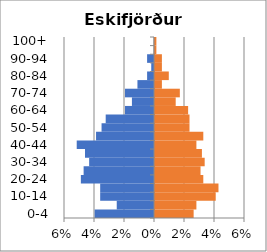
| Category | % Men | % Women |
|---|---|---|
| 0-4 | -0.04 | 0.026 |
| 5-9 | -0.025 | 0.028 |
| 10-14 | -0.036 | 0.04 |
| 15-19 | -0.036 | 0.042 |
| 20-24 | -0.049 | 0.032 |
| 25-29 | -0.047 | 0.03 |
| 30-34 | -0.043 | 0.033 |
| 35-39 | -0.046 | 0.031 |
| 40-44 | -0.052 | 0.028 |
| 45-49 | -0.039 | 0.032 |
| 50-54 | -0.035 | 0.023 |
| 55-59 | -0.032 | 0.023 |
| 60-64 | -0.019 | 0.022 |
| 65-69 | -0.015 | 0.014 |
| 70-74 | -0.019 | 0.017 |
| 75-79 | -0.011 | 0.005 |
| 80-84 | -0.005 | 0.009 |
| 85-89 | -0.002 | 0.005 |
| 90-94 | -0.005 | 0.005 |
| 95-99 | 0 | 0.001 |
| 100+ | 0 | 0.001 |